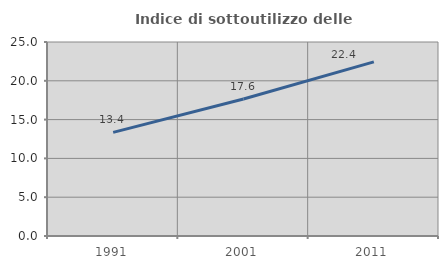
| Category | Indice di sottoutilizzo delle abitazioni  |
|---|---|
| 1991.0 | 13.357 |
| 2001.0 | 17.647 |
| 2011.0 | 22.432 |